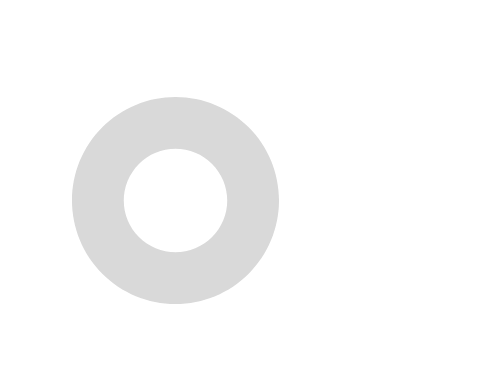
| Category | Series 0 |
|---|---|
| #Yes at wrap | 0 |
| No | 0 |
| Unanswered | 112 |